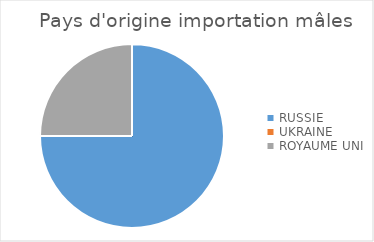
| Category | Series 0 |
|---|---|
| RUSSIE | 3 |
| UKRAINE | 0 |
| ROYAUME UNI | 1 |